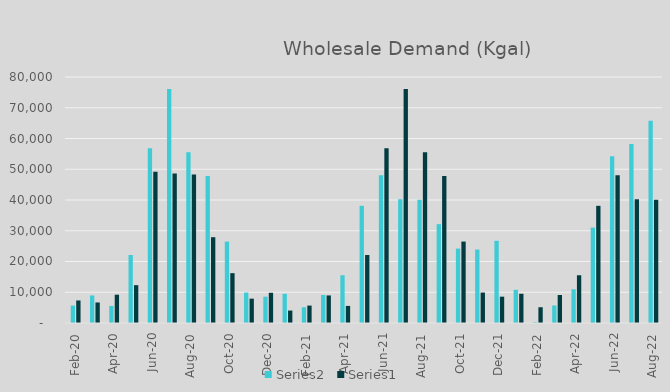
| Category | Series 1 | Series 0 |
|---|---|---|
| 2020-02-01 | 5662 | 7328 |
| 2020-03-01 | 8964 | 6673 |
| 2020-04-01 | 5557 | 9201 |
| 2020-05-01 | 22105 | 12299 |
| 2020-06-01 | 56817 | 49180 |
| 2020-07-01 | 76109 | 48620 |
| 2020-08-01 | 55541 | 48323 |
| 2020-09-01 | 47807 | 27902 |
| 2020-10-01 | 26480 | 16206 |
| 2020-11-01 | 9900 | 7918 |
| 2020-12-01 | 8560 | 9824 |
| 2021-01-01 | 9512 | 4042 |
| 2021-02-01 | 5125 | 5662 |
| 2021-03-01 | 9106 | 8964 |
| 2021-04-01 | 15528 | 5557 |
| 2021-05-01 | 38104 | 22105 |
| 2021-06-01 | 48016 | 56817 |
| 2021-07-01 | 40242 | 76109 |
| 2021-08-01 | 40077 | 55541 |
| 2021-09-01 | 32142 | 47807 |
| 2021-10-01 | 24194 | 26480 |
| 2021-11-01 | 23901 | 9900 |
| 2021-12-01 | 26722 | 8560 |
| 2022-01-01 | 10791 | 9512 |
| 2022-02-01 | 243 | 5125 |
| 2022-03-01 | 5698 | 9106 |
| 2022-04-01 | 10969 | 15528 |
| 2022-05-01 | 31016 | 38104 |
| 2022-06-01 | 54204 | 48016 |
| 2022-07-01 | 58207 | 40242 |
| 2022-08-01 | 65734 | 40077 |